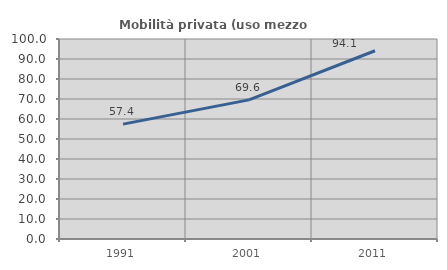
| Category | Mobilità privata (uso mezzo privato) |
|---|---|
| 1991.0 | 57.447 |
| 2001.0 | 69.565 |
| 2011.0 | 94.118 |